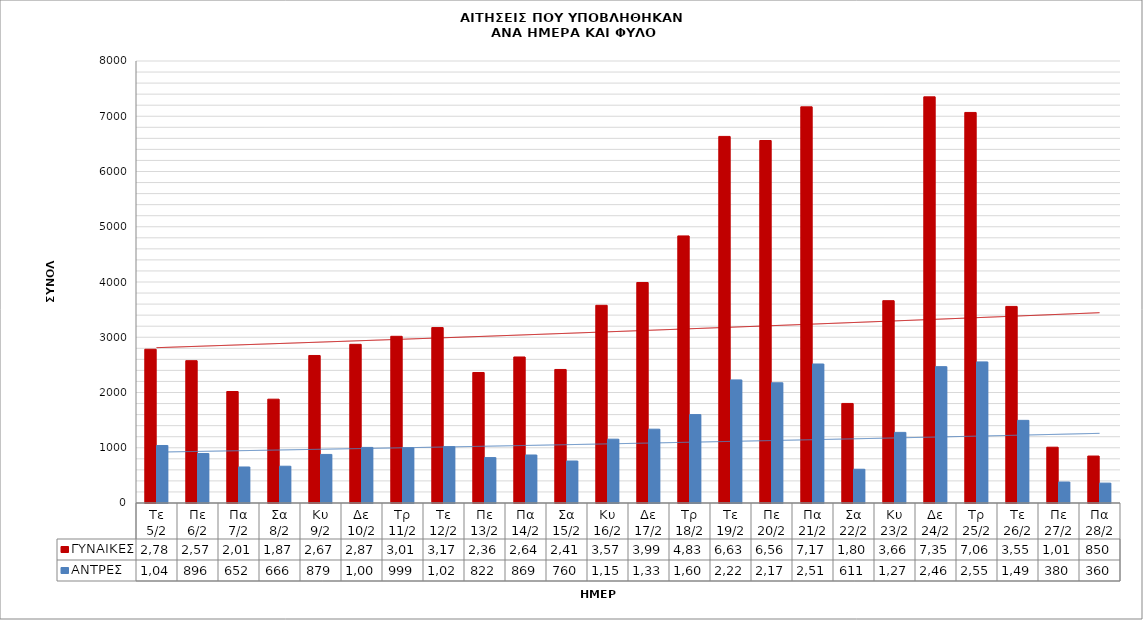
| Category | ΓΥΝΑΙΚΕΣ | ΑΝΤΡΕΣ |
|---|---|---|
| Τε 5/2 | 2783 | 1041 |
| Πε 6/2 | 2576 | 896 |
| Πα 7/2 | 2018 | 652 |
| Σα 8/2 | 1879 | 666 |
| Κυ 9/2 | 2670 | 879 |
| Δε 10/2 | 2872 | 1006 |
| Τρ 11/2 | 3017 | 999 |
| Τε 12/2 | 3175 | 1020 |
| Πε 13/2 | 2362 | 822 |
| Πα 14/2 | 2643 | 869 |
| Σα 15/2 | 2417 | 760 |
| Κυ 16/2 | 3578 | 1155 |
| Δε 17/2 | 3991 | 1336 |
| Τρ 18/2 | 4834 | 1600 |
| Τε 19/2 | 6635 | 2228 |
| Πε 20/2 | 6561 | 2176 |
| Πα 21/2 | 7170 | 2516 |
| Σα 22/2 | 1802 | 611 |
| Κυ 23/2 | 3662 | 1278 |
| Δε 24/2 | 7351 | 2468 |
| Τρ 25/2 | 7069 | 2554 |
| Τε 26/2 | 3558 | 1496 |
| Πε 27/2 | 1010 | 380 |
| Πα 28/2 | 850 | 360 |